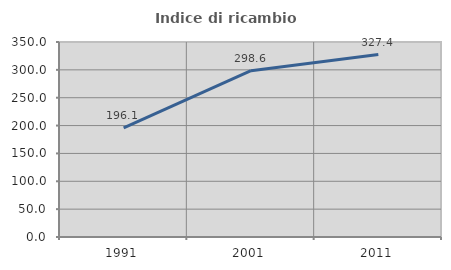
| Category | Indice di ricambio occupazionale  |
|---|---|
| 1991.0 | 196.053 |
| 2001.0 | 298.558 |
| 2011.0 | 327.426 |